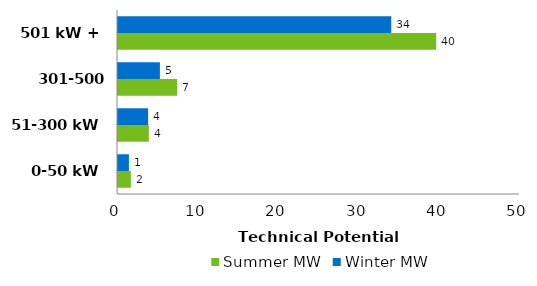
| Category | Summer MW | Winter MW |
|---|---|---|
| 0-50 kW | 1.596 | 1.357 |
| 51-300 kW | 3.837 | 3.748 |
| 301-500 kW | 7.355 | 5.213 |
| 501 kW + | 39.58 | 33.984 |